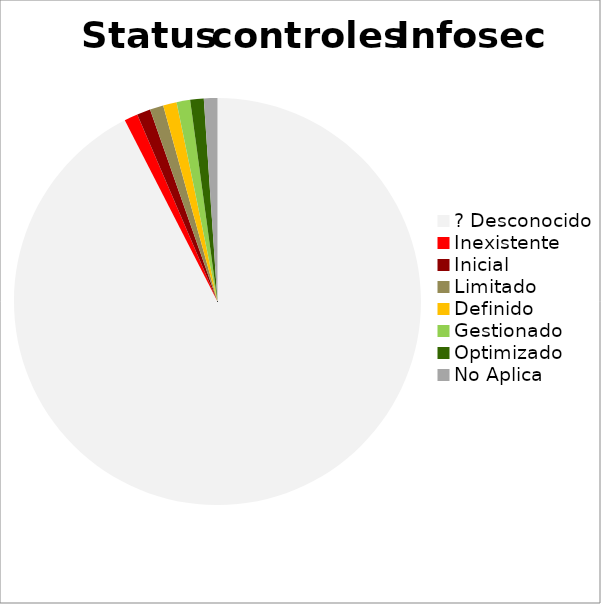
| Category | Proporción de controles de seguridad de la información |
|---|---|
| ? Desconocido | 0.925 |
| Inexistente | 0.011 |
| Inicial | 0.011 |
| Limitado | 0.011 |
| Definido | 0.011 |
| Gestionado | 0.011 |
| Optimizado | 0.011 |
| No Aplica | 0.011 |